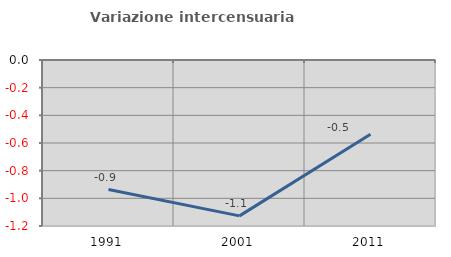
| Category | Variazione intercensuaria annua |
|---|---|
| 1991.0 | -0.937 |
| 2001.0 | -1.127 |
| 2011.0 | -0.536 |